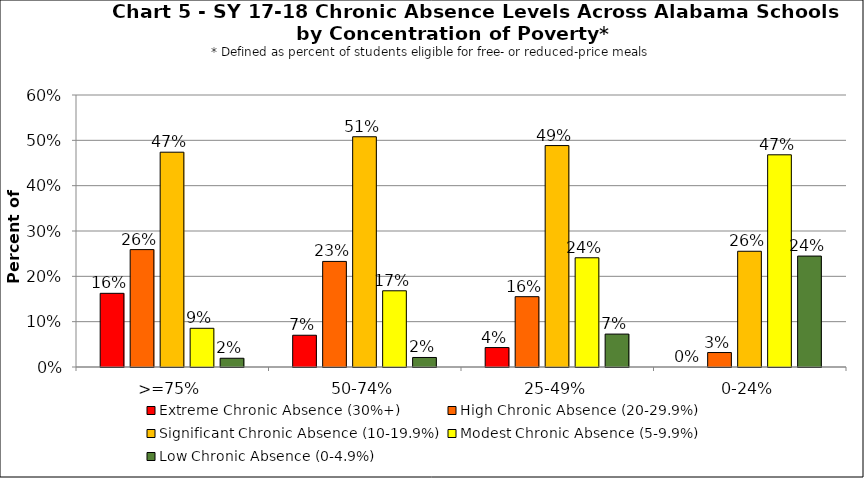
| Category | Extreme Chronic Absence (30%+) | High Chronic Absence (20-29.9%) | Significant Chronic Absence (10-19.9%) | Modest Chronic Absence (5-9.9%) | Low Chronic Absence (0-4.9%) |
|---|---|---|---|---|---|
| 0 | 0.163 | 0.259 | 0.474 | 0.085 | 0.019 |
| 1 | 0.07 | 0.233 | 0.508 | 0.168 | 0.021 |
| 2 | 0.043 | 0.155 | 0.488 | 0.241 | 0.073 |
| 3 | 0 | 0.032 | 0.255 | 0.468 | 0.245 |